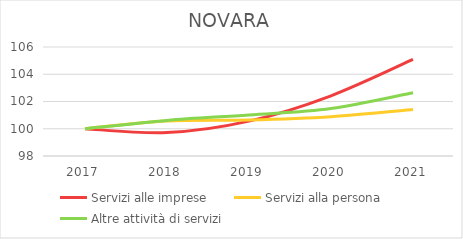
| Category | Servizi alle imprese | Servizi alla persona | Altre attività di servizi |
|---|---|---|---|
| 2017.0 | 100 | 100 | 100 |
| 2018.0 | 99.721 | 100.565 | 100.614 |
| 2019.0 | 100.558 | 100.645 | 101.015 |
| 2020.0 | 102.419 | 100.887 | 101.487 |
| 2021.0 | 105.087 | 101.411 | 102.644 |